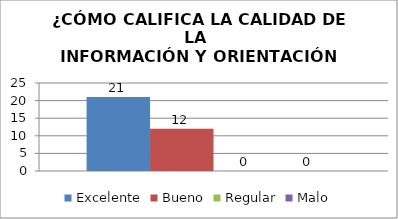
| Category | Excelente | Bueno | Regular | Malo |
|---|---|---|---|---|
| 0 | 21 | 12 | 0 | 0 |